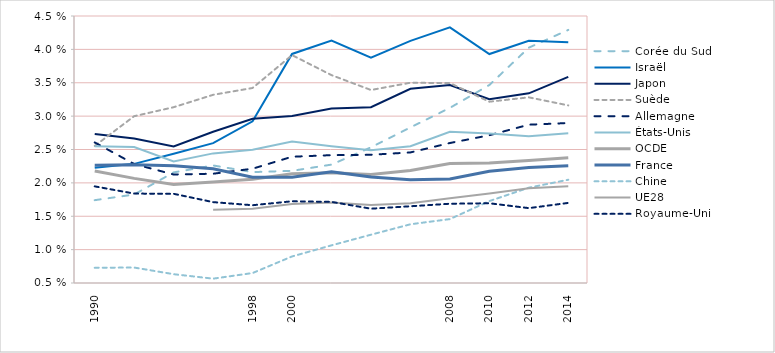
| Category | Corée du Sud | Israël | Japon | Suède | Allemagne | États-Unis | OCDE | France | Chine | UE28 | Royaume-Uni |
|---|---|---|---|---|---|---|---|---|---|---|---|
| 1990 | 1.741 | 2.228 | 2.732 | 2.554 | 2.606 | 2.548 | 2.177 | 2.263 | 0.728 | 0 | 1.948 |
|  | 1.826 | 2.285 | 2.664 | 2.999 | 2.282 | 2.536 | 2.067 | 2.271 | 0.732 | 0 | 1.84 |
|  | 2.157 | 2.436 | 2.547 | 3.134 | 2.125 | 2.321 | 1.975 | 2.256 | 0.632 | 0 | 1.836 |
|  | 2.261 | 2.596 | 2.765 | 3.319 | 2.137 | 2.442 | 2.012 | 2.211 | 0.565 | 1.599 | 1.712 |
| 1998 | 2.162 | 2.921 | 2.96 | 3.422 | 2.212 | 2.497 | 2.054 | 2.084 | 0.649 | 1.612 | 1.665 |
| 2000 | 2.18 | 3.932 | 3.002 | 3.914 | 2.392 | 2.621 | 2.138 | 2.084 | 0.898 | 1.682 | 1.724 |
|  | 2.274 | 4.132 | 3.116 | 3.614 | 2.415 | 2.55 | 2.152 | 2.166 | 1.064 | 1.706 | 1.715 |
|  | 2.532 | 3.875 | 3.133 | 3.391 | 2.421 | 2.49 | 2.127 | 2.086 | 1.223 | 1.67 | 1.613 |
|  | 2.831 | 4.128 | 3.409 | 3.5 | 2.456 | 2.55 | 2.187 | 2.045 | 1.38 | 1.695 | 1.65 |
| 2008 | 3.123 | 4.329 | 3.467 | 3.495 | 2.597 | 2.767 | 2.291 | 2.058 | 1.457 | 1.768 | 1.687 |
| 2010 | 3.466 | 3.93 | 3.252 | 3.216 | 2.714 | 2.74 | 2.299 | 2.175 | 1.727 | 1.842 | 1.695 |
| 2012 | 4.026 | 4.129 | 3.342 | 3.281 | 2.872 | 2.699 | 2.336 | 2.229 | 1.928 | 1.921 | 1.622 |
| 2014 | 4.292 | 4.109 | 3.588 | 3.161 | 2.897 | 2.742 | 2.377 | 2.256 | 2.047 | 1.951 | 1.7 |